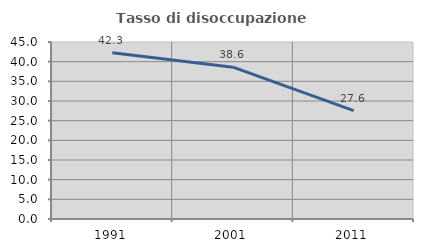
| Category | Tasso di disoccupazione giovanile  |
|---|---|
| 1991.0 | 42.258 |
| 2001.0 | 38.602 |
| 2011.0 | 27.562 |